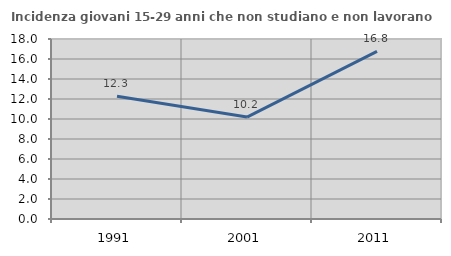
| Category | Incidenza giovani 15-29 anni che non studiano e non lavorano  |
|---|---|
| 1991.0 | 12.284 |
| 2001.0 | 10.192 |
| 2011.0 | 16.765 |